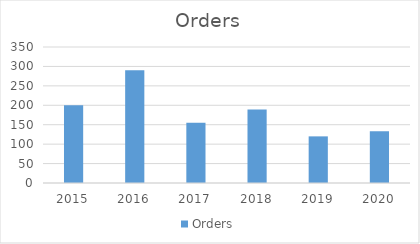
| Category | Orders |
|---|---|
| 2015.0 | 200 |
| 2016.0 | 290 |
| 2017.0 | 155 |
| 2018.0 | 189 |
| 2019.0 | 120 |
| 2020.0 | 133 |